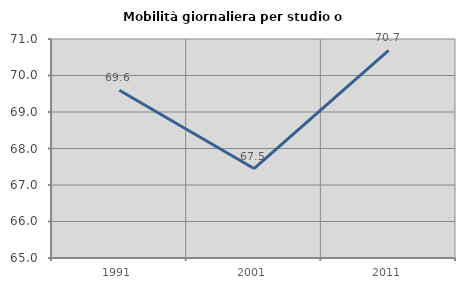
| Category | Mobilità giornaliera per studio o lavoro |
|---|---|
| 1991.0 | 69.597 |
| 2001.0 | 67.451 |
| 2011.0 | 70.69 |